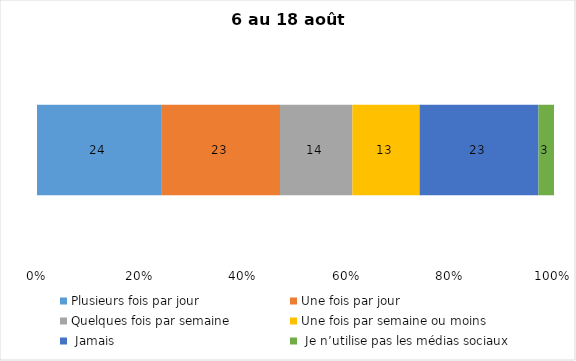
| Category | Plusieurs fois par jour | Une fois par jour | Quelques fois par semaine   | Une fois par semaine ou moins   |  Jamais   |  Je n’utilise pas les médias sociaux |
|---|---|---|---|---|---|---|
| 0 | 24 | 23 | 14 | 13 | 23 | 3 |